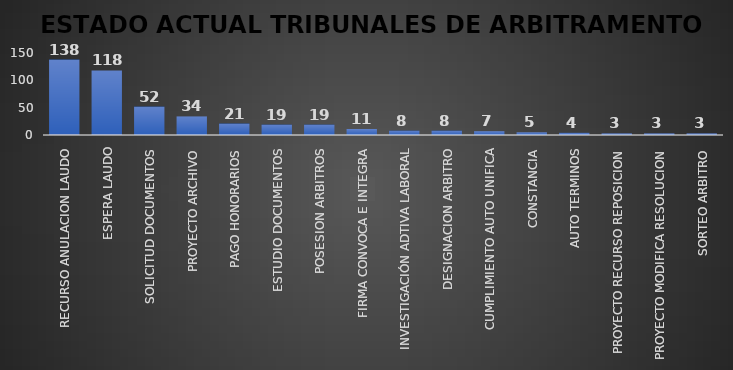
| Category | CANTIDAD | % |
|---|---|---|
| RECURSO ANULACION LAUDO | 138 | 0.299 |
| ESPERA LAUDO | 118 | 0.235 |
| SOLICITUD DOCUMENTOS | 52 | 0.109 |
| PROYECTO ARCHIVO | 34 | 0.08 |
| PAGO HONORARIOS | 21 | 0.047 |
| ESTUDIO DOCUMENTOS | 19 | 0.042 |
| POSESION ARBITROS | 19 | 0.039 |
| FIRMA CONVOCA E INTEGRA | 11 | 0.026 |
| INVESTIGACIÓN ADTIVA LABORAL | 8 | 0.015 |
| DESIGNACION ARBITRO | 8 | 0.023 |
| CUMPLIMIENTO AUTO UNIFICA | 7 | 0.015 |
| CONSTANCIA | 5 | 0.013 |
| AUTO TERMINOS | 4 | 0.007 |
| PROYECTO RECURSO REPOSICION | 3 | 0.006 |
| PROYECTO MODIFICA RESOLUCION | 3 | 0.006 |
| SORTEO ARBITRO | 3 | 0.009 |